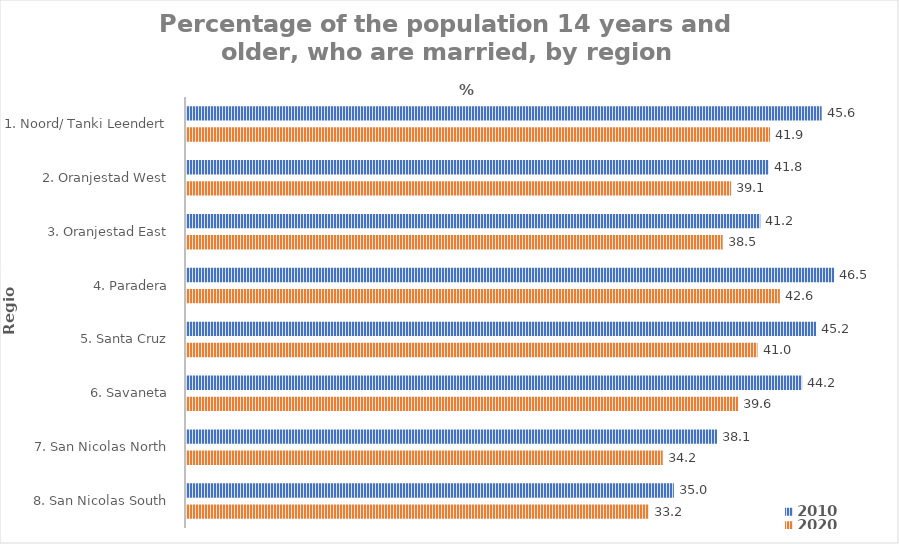
| Category | 2010 | 2020 |
|---|---|---|
| 1. Noord/ Tanki Leendert | 45.6 | 41.9 |
| 2. Oranjestad West | 41.8 | 39.1 |
| 3. Oranjestad East | 41.2 | 38.5 |
| 4. Paradera | 46.5 | 42.6 |
| 5. Santa Cruz | 45.2 | 41 |
| 6. Savaneta | 44.2 | 39.6 |
| 7. San Nicolas North | 38.1 | 34.2 |
| 8. San Nicolas South | 35 | 33.2 |